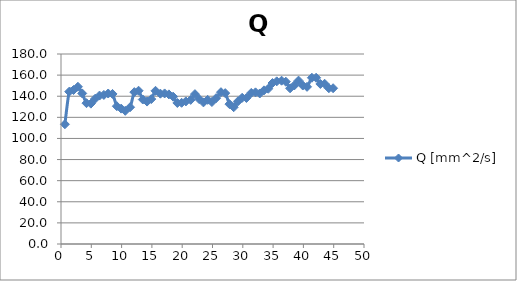
| Category | Q [mm^2/s] |
|---|---|
| 0.643 | 113.437 |
| 1.36 | 144.306 |
| 2.07 | 145.903 |
| 2.79 | 148.958 |
| 3.5 | 142.639 |
| 4.21 | 133.417 |
| 4.93 | 132.986 |
| 5.64 | 137.639 |
| 6.36 | 140.625 |
| 7.07 | 141.208 |
| 7.79 | 142.569 |
| 8.5 | 142.153 |
| 9.21 | 130.556 |
| 9.93 | 128.264 |
| 10.6 | 126.181 |
| 11.4 | 129.583 |
| 12.1 | 143.889 |
| 12.8 | 145.208 |
| 13.5 | 136.875 |
| 14.2 | 134.931 |
| 14.9 | 137.292 |
| 15.6 | 145.139 |
| 16.4 | 142.431 |
| 17.1 | 142.639 |
| 17.8 | 141.736 |
| 18.5 | 139.583 |
| 19.2 | 133.611 |
| 19.9 | 133.785 |
| 20.6 | 135.069 |
| 21.4 | 136.528 |
| 22.1 | 141.979 |
| 22.8 | 137.222 |
| 23.5 | 134.167 |
| 24.2 | 136.597 |
| 24.9 | 134.514 |
| 25.6 | 138.201 |
| 26.4 | 143.819 |
| 27.1 | 142.917 |
| 27.8 | 132.5 |
| 28.5 | 129.583 |
| 29.2 | 135.139 |
| 29.9 | 138.514 |
| 30.6 | 138.333 |
| 31.4 | 143.125 |
| 32.1 | 143.667 |
| 32.8 | 142.604 |
| 33.5 | 145.556 |
| 34.2 | 147.083 |
| 34.9 | 152.5 |
| 35.6 | 154.097 |
| 36.4 | 154.722 |
| 37.1 | 153.75 |
| 37.8 | 147.5 |
| 38.5 | 150.208 |
| 39.2 | 154.792 |
| 39.9 | 150.139 |
| 40.6 | 148.889 |
| 41.4 | 157.5 |
| 42.1 | 157.5 |
| 42.8 | 151.597 |
| 43.5 | 151.806 |
| 44.2 | 147.569 |
| 44.9 | 147.569 |